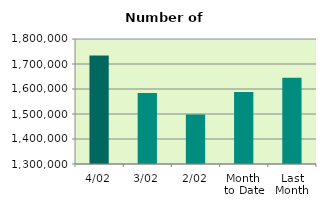
| Category | Series 0 |
|---|---|
| 4/02 | 1733778 |
| 3/02 | 1584298 |
| 2/02 | 1497860 |
| Month 
to Date | 1588433 |
| Last
Month | 1644892 |